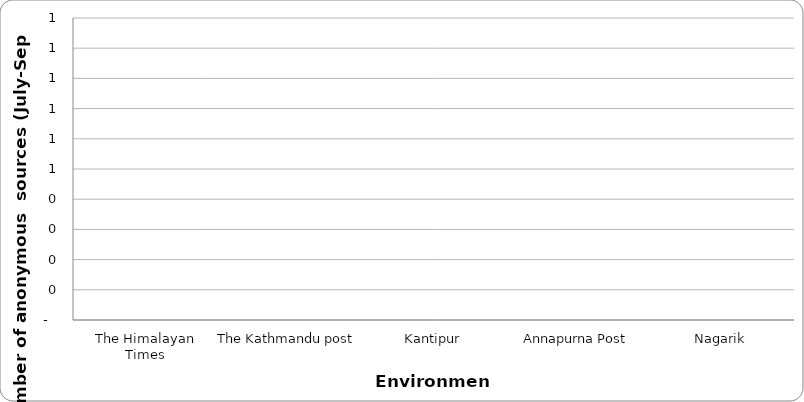
| Category | Environment |
|---|---|
| The Himalayan Times | 0 |
| The Kathmandu post | 0 |
| Kantipur | 0 |
| Annapurna Post | 0 |
| Nagarik | 0 |